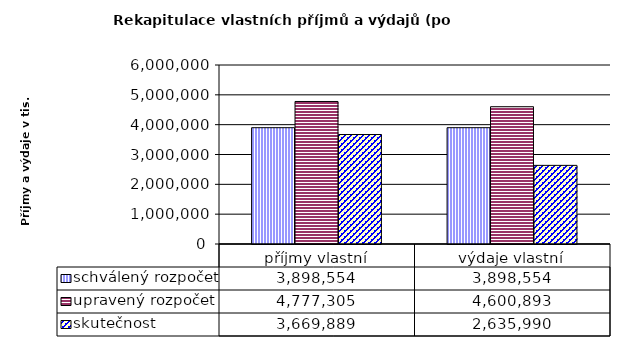
| Category | schválený rozpočet | upravený rozpočet | skutečnost |
|---|---|---|---|
| příjmy vlastní | 3898554 | 4777305 | 3669889 |
| výdaje vlastní | 3898554 | 4600893 | 2635990 |